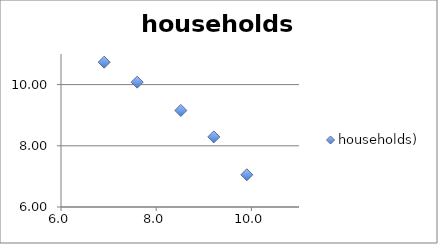
| Category | households) |
|---|---|
| 9.903487552536127 | 7.053 |
| 9.210340371976184 | 8.291 |
| 8.517193191416238 | 9.155 |
| 7.600902459542082 | 10.079 |
| 6.907755278982137 | 10.732 |